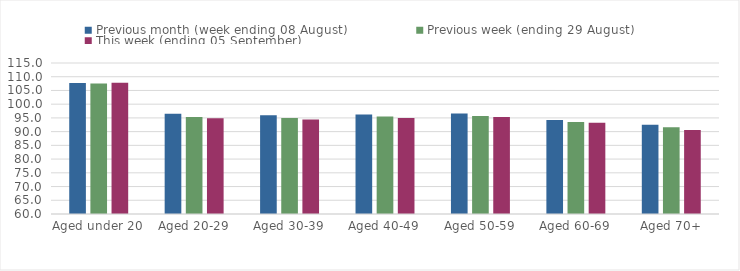
| Category | Previous month (week ending 08 August) | Previous week (ending 29 August) | This week (ending 05 September) |
|---|---|---|---|
| Aged under 20 | 107.68 | 107.53 | 107.78 |
| Aged 20-29 | 96.51 | 95.36 | 94.88 |
| Aged 30-39 | 95.98 | 94.99 | 94.43 |
| Aged 40-49 | 96.25 | 95.49 | 94.99 |
| Aged 50-59 | 96.57 | 95.71 | 95.32 |
| Aged 60-69 | 94.27 | 93.53 | 93.27 |
| Aged 70+ | 92.5 | 91.57 | 90.63 |